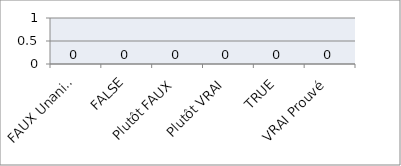
| Category | Series 0 |
|---|---|
| FAUX Unanime | 0 |
| FAUX | 0 |
| Plutôt FAUX | 0 |
| Plutôt VRAI | 0 |
| VRAI | 0 |
| VRAI Prouvé | 0 |